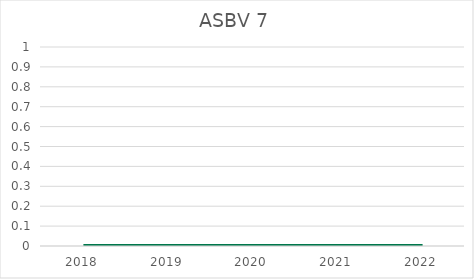
| Category | ASBV 7 |
|---|---|
| 2018.0 | 0 |
| 2019.0 | 0 |
| 2020.0 | 0 |
| 2021.0 | 0 |
| 2022.0 | 0 |